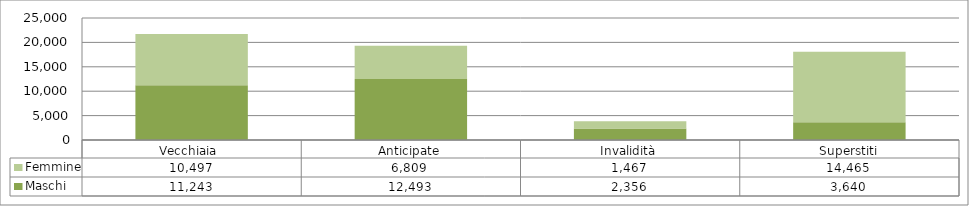
| Category | Maschi | Femmine |
|---|---|---|
| Vecchiaia  | 11243 | 10497 |
| Anticipate | 12493 | 6809 |
| Invalidità | 2356 | 1467 |
| Superstiti | 3640 | 14465 |